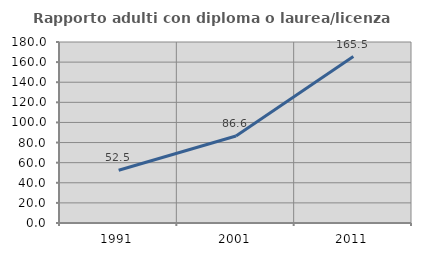
| Category | Rapporto adulti con diploma o laurea/licenza media  |
|---|---|
| 1991.0 | 52.5 |
| 2001.0 | 86.567 |
| 2011.0 | 165.517 |